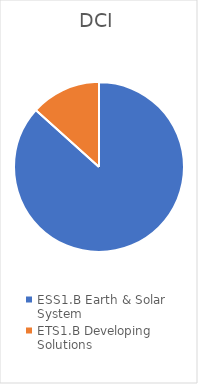
| Category | DCI |
|---|---|
| ESS1.B Earth & Solar System | 0.867 |
| ETS1.B Developing Solutions | 0.133 |